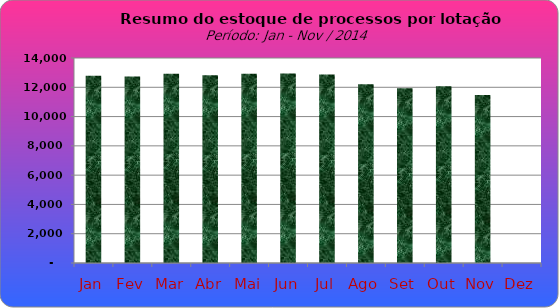
| Category | Series 0 |
|---|---|
| Jan | 12795 |
| Fev | 12744 |
| Mar | 12928 |
| Abr | 12816 |
| Mai | 12923 |
| Jun | 12943 |
| Jul | 12869 |
| Ago | 12202 |
| Set | 11937 |
| Out | 12070 |
| Nov | 11474 |
| Dez | 0 |